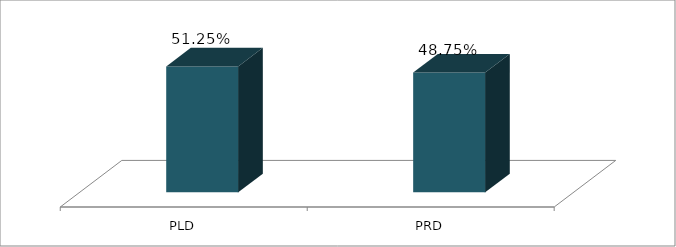
| Category | Votos % |
|---|---|
| PLD | 0.513 |
| PRD | 0.487 |